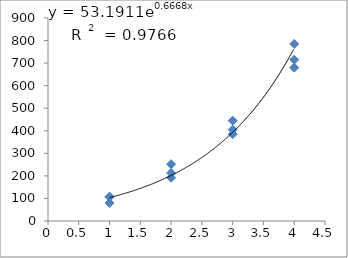
| Category | Series 0 |
|---|---|
| 1.0 | 108 |
| 1.0 | 106 |
| 1.0 | 80 |
| 2.0 | 192 |
| 2.0 | 252 |
| 2.0 | 213 |
| 3.0 | 405 |
| 3.0 | 385 |
| 3.0 | 445 |
| 4.0 | 680 |
| 4.0 | 785 |
| 4.0 | 715 |